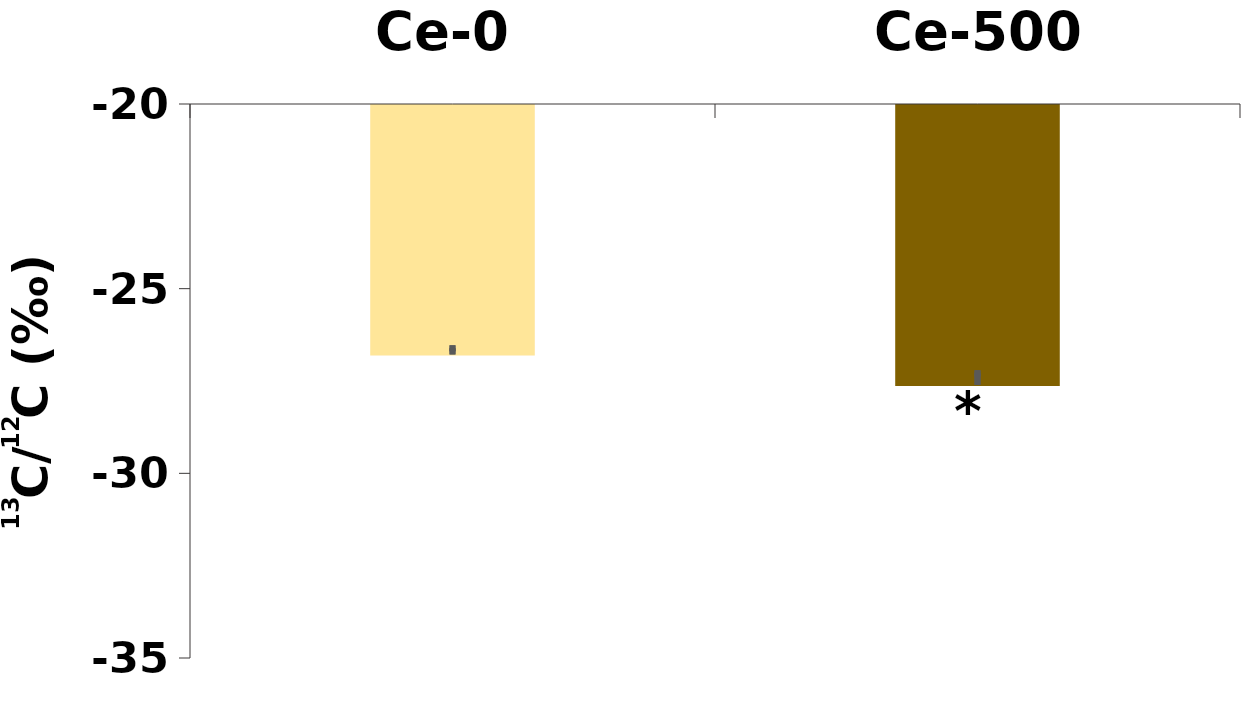
| Category | δ13C |
|---|---|
| Ce-0 | -26.782 |
| Ce-500 | -27.608 |